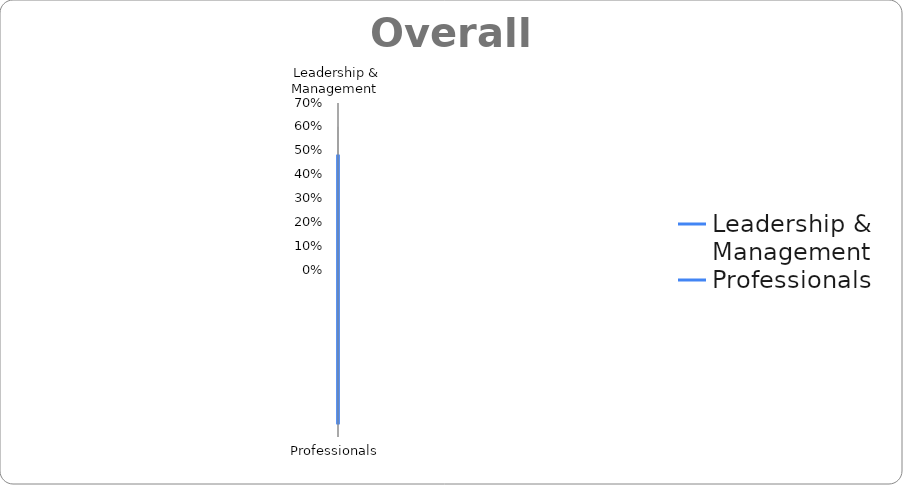
| Category | Series 0 |
|---|---|
| Leadership & Management  | 0.483 |
| Professionals  | 0.646 |